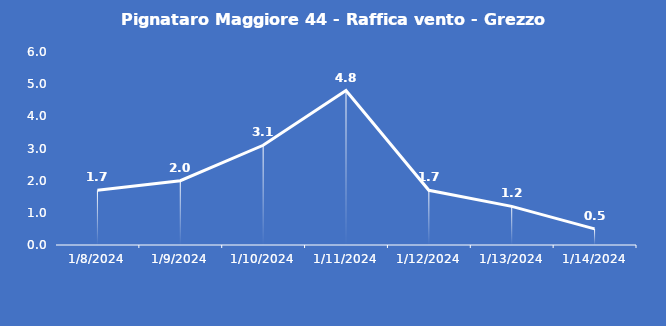
| Category | Pignataro Maggiore 44 - Raffica vento - Grezzo (m/s) |
|---|---|
| 1/8/24 | 1.7 |
| 1/9/24 | 2 |
| 1/10/24 | 3.1 |
| 1/11/24 | 4.8 |
| 1/12/24 | 1.7 |
| 1/13/24 | 1.2 |
| 1/14/24 | 0.5 |